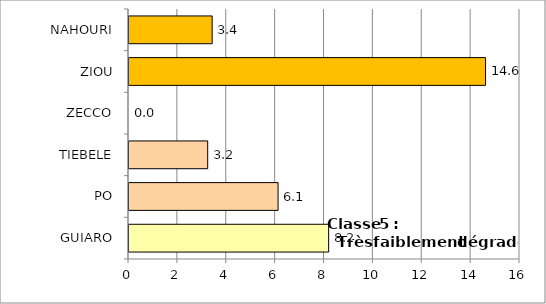
| Category | Series 0 |
|---|---|
| GUIARO | 8.17 |
| PO | 6.1 |
| TIEBELE | 3.22 |
| ZECCO | 0 |
| ZIOU | 14.59 |
| NAHOURI | 3.403 |